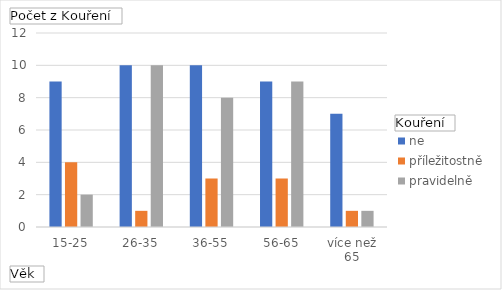
| Category | ne | příležitostně | pravidelně |
|---|---|---|---|
| 15-25 | 9 | 4 | 2 |
| 26-35 | 10 | 1 | 10 |
| 36-55 | 10 | 3 | 8 |
| 56-65 | 9 | 3 | 9 |
| více než 65 | 7 | 1 | 1 |